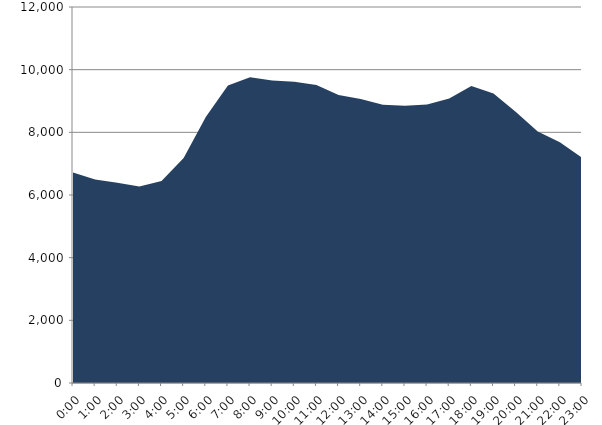
| Category | Series 0 | Series 1 |
|---|---|---|
| 2019-10-16 |  | 6717.27 |
| 2019-10-16 01:00:00 |  | 6497.34 |
| 2019-10-16 02:00:00 |  | 6388.51 |
| 2019-10-16 03:00:00 |  | 6270.26 |
| 2019-10-16 04:00:00 |  | 6443.79 |
| 2019-10-16 05:00:00 |  | 7181.92 |
| 2019-10-16 06:00:00 |  | 8487.35 |
| 2019-10-16 07:00:00 |  | 9495.21 |
| 2019-10-16 08:00:00 |  | 9754.37 |
| 2019-10-16 09:00:00 |  | 9651.08 |
| 2019-10-16 10:00:00 |  | 9612.76 |
| 2019-10-16 11:00:00 |  | 9507.57 |
| 2019-10-16 12:00:00 |  | 9189.54 |
| 2019-10-16 13:00:00 |  | 9063.57 |
| 2019-10-16 14:00:00 |  | 8882.4 |
| 2019-10-16 15:00:00 |  | 8850.08 |
| 2019-10-16 16:00:00 |  | 8888.42 |
| 2019-10-16 17:00:00 |  | 9076.22 |
| 2019-10-16 18:00:00 |  | 9477.51 |
| 2019-10-16 19:00:00 |  | 9240.11 |
| 2019-10-16 20:00:00 |  | 8659.54 |
| 2019-10-16 21:00:00 |  | 8030.18 |
| 2019-10-16 22:00:00 |  | 7685.52 |
| 2019-10-16 23:00:00 |  | 7188.4 |